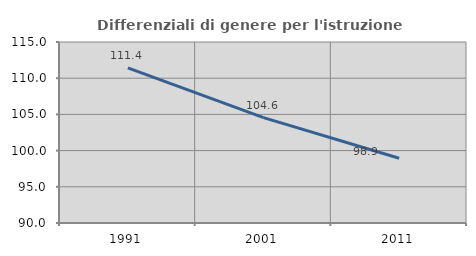
| Category | Differenziali di genere per l'istruzione superiore |
|---|---|
| 1991.0 | 111.432 |
| 2001.0 | 104.56 |
| 2011.0 | 98.94 |